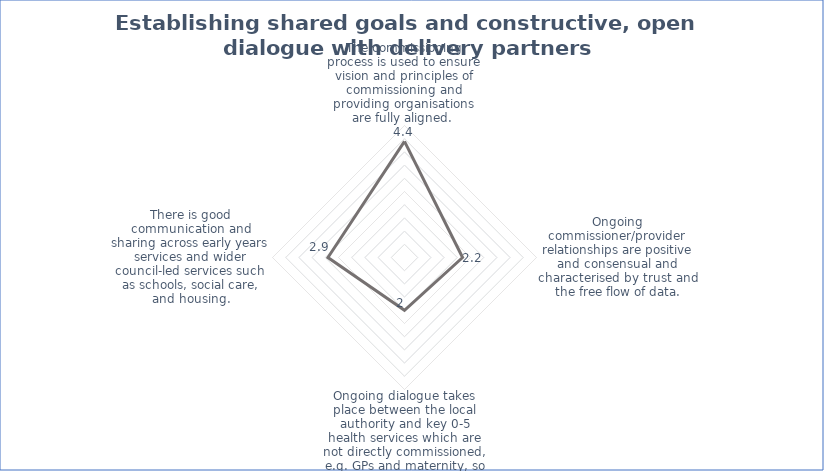
| Category | Series 0 |
|---|---|
| The commissioning process is used to ensure vision and principles of commissioning and providing organisations are fully aligned.  | 4.4 |
| Ongoing commissioner/provider relationships are positive and consensual and characterised by trust and the free flow of data. | 2.2 |
| Ongoing dialogue takes place between the local authority and key 0-5 health services which are not directly commissioned, e.g. GPs and maternity, so that the best possible service alignment is achieved for families. | 2 |
| There is good communication and sharing across early years services and wider council-led services such as schools, social care, and housing. | 2.9 |